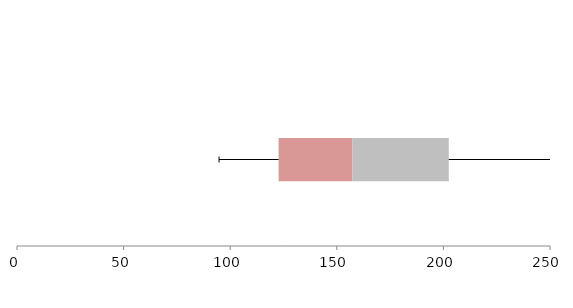
| Category | Series 1 | Series 2 | Series 3 |
|---|---|---|---|
| 0 | 122.71 | 34.583 | 45.233 |